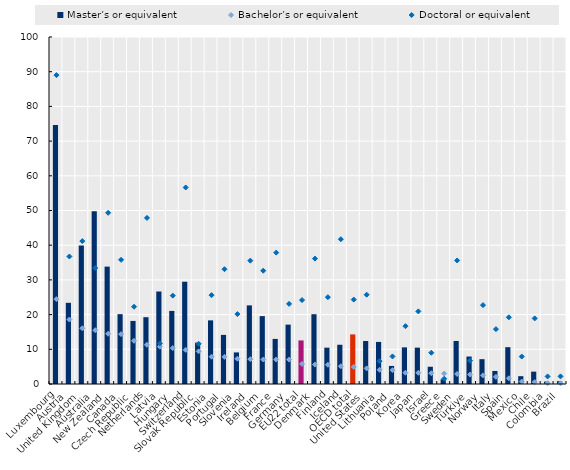
| Category | Master’s or equivalent |
|---|---|
| Luxembourg | 74.616 |
| Austria | 23.399 |
| United Kingdom | 39.903 |
| Australia | 49.775 |
| New Zealand | 33.824 |
| Canada | 20.126 |
| Czech Republic | 18.176 |
| Netherlands | 19.251 |
| Latvia | 26.658 |
| Hungary | 21.058 |
| Switzerland | 29.475 |
| Slovak Republic | 11.932 |
| Estonia | 18.339 |
| Portugal | 14.154 |
| Slovenia | 9.104 |
| Ireland | 22.658 |
| Belgium | 19.56 |
| France | 12.996 |
| Germany | 17.112 |
| EU22 total | 12.56 |
| Denmark | 20.115 |
| Finland | 10.472 |
| Iceland | 11.312 |
| OECD total | 14.299 |
| United States | 12.387 |
| Lithuania | 12.124 |
| Poland | 5.203 |
| Korea | 10.558 |
| Japan | 10.479 |
| Israel | 4.973 |
| Greece | 1.348 |
| Sweden | 12.405 |
| Türkiye | 7.916 |
| Norway | 7.155 |
| Italy | 3.759 |
| Spain | 10.611 |
| Mexico | 2.254 |
| Chile | 3.564 |
| Colombia | 0.691 |
| Brazil | 0.831 |